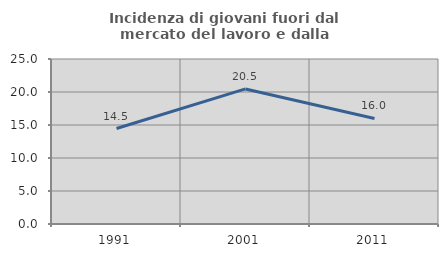
| Category | Incidenza di giovani fuori dal mercato del lavoro e dalla formazione  |
|---|---|
| 1991.0 | 14.468 |
| 2001.0 | 20.467 |
| 2011.0 | 15.996 |